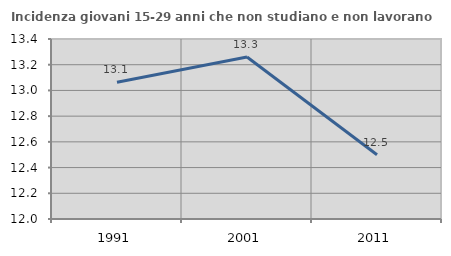
| Category | Incidenza giovani 15-29 anni che non studiano e non lavorano  |
|---|---|
| 1991.0 | 13.064 |
| 2001.0 | 13.26 |
| 2011.0 | 12.5 |